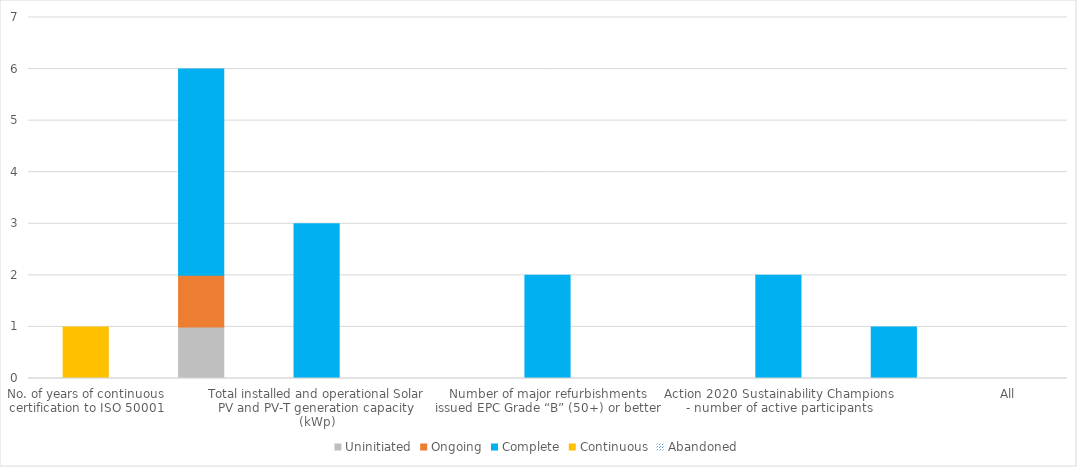
| Category | Uninitiated | Ongoing | Complete | Continuous | Abandoned |
|---|---|---|---|---|---|
| No. of years of continuous certification to ISO 50001 | 0 | 0 | 0 | 1 | 0 |
| Total University EMR reported energy consumption (kWh/m2) | 1 | 1 | 4 | 0 | 0 |
| Total installed and operational Solar PV and PV-T generation capacity (kWp) | 0 | 0 | 3 | 0 | 0 |
| Electronic and electrical equipment purchases (>£50k) with energy usage as part of the assessment | 0 | 0 | 0 | 0 | 0 |
| Number of major refurbishments issued EPC Grade “B” (50+) or better | 0 | 0 | 2 | 0 | 0 |
| Number of new builds issued EPC Grade “A” (25+) | 0 | 0 | 0 | 0 | 0 |
| Action 2020 Sustainability Champions - number of active participants | 0 | 0 | 2 | 0 | 0 |
| Number of active participants in ResAction as part of ResLife | 0 | 0 | 1 | 0 | 0 |
| All | 0 | 0 | 0 | 0 | 0 |